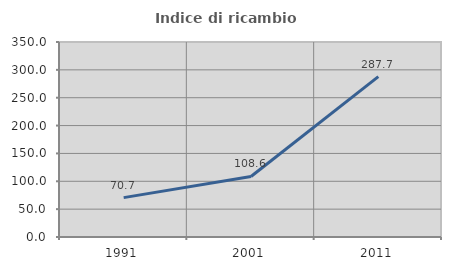
| Category | Indice di ricambio occupazionale  |
|---|---|
| 1991.0 | 70.701 |
| 2001.0 | 108.602 |
| 2011.0 | 287.73 |